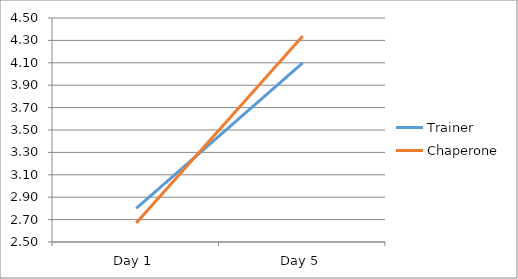
| Category | Trainer | Chaperone |
|---|---|---|
| Day 1 | 2.8 | 2.67 |
| Day 5 | 4.1 | 4.34 |